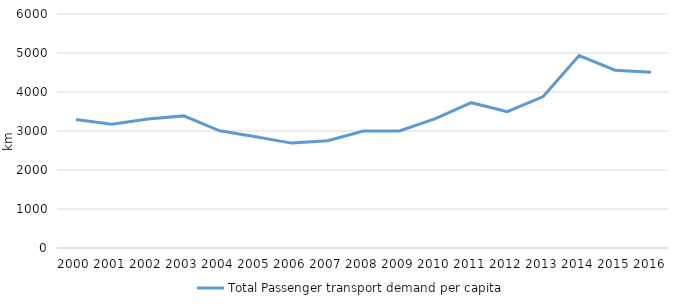
| Category | Total Passenger transport demand per capita  |
|---|---|
| 2000.0 | 3296.224 |
| 2001.0 | 3173.667 |
| 2002.0 | 3305.407 |
| 2003.0 | 3387.372 |
| 2004.0 | 3005.116 |
| 2005.0 | 2853.059 |
| 2006.0 | 2689.598 |
| 2007.0 | 2751.351 |
| 2008.0 | 3001.046 |
| 2009.0 | 3002.355 |
| 2010.0 | 3316.022 |
| 2011.0 | 3726.101 |
| 2012.0 | 3495.622 |
| 2013.0 | 3884.268 |
| 2014.0 | 4933.374 |
| 2015.0 | 4558.055 |
| 2016.0 | 4505.951 |